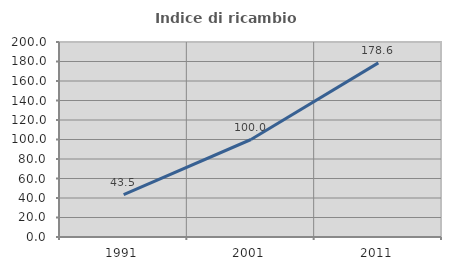
| Category | Indice di ricambio occupazionale  |
|---|---|
| 1991.0 | 43.478 |
| 2001.0 | 100 |
| 2011.0 | 178.571 |